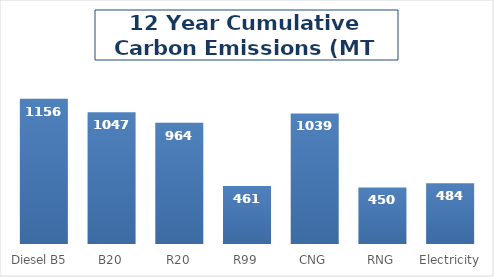
| Category | Series 0 |
|---|---|
| Diesel B5  | 1155.686 |
| B20 | 1047.217 |
| R20 | 963.992 |
| R99 | 460.697 |
| CNG | 1038.671 |
| RNG | 450.4 |
| Electricity | 483.748 |